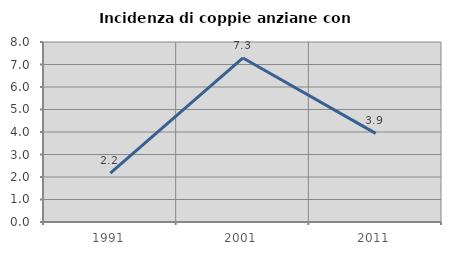
| Category | Incidenza di coppie anziane con figli |
|---|---|
| 1991.0 | 2.174 |
| 2001.0 | 7.292 |
| 2011.0 | 3.941 |